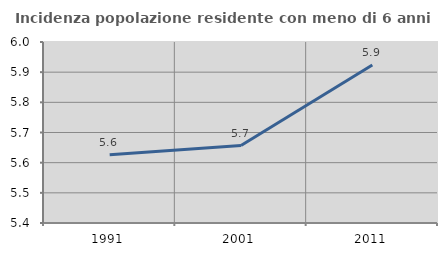
| Category | Incidenza popolazione residente con meno di 6 anni |
|---|---|
| 1991.0 | 5.626 |
| 2001.0 | 5.657 |
| 2011.0 | 5.924 |